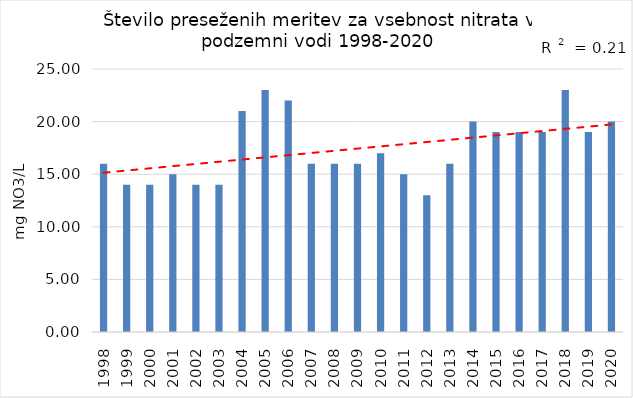
| Category | Series 0 |
|---|---|
| 1998.0 | 16 |
| 1999.0 | 14 |
| 2000.0 | 14 |
| 2001.0 | 15 |
| 2002.0 | 14 |
| 2003.0 | 14 |
| 2004.0 | 21 |
| 2005.0 | 23 |
| 2006.0 | 22 |
| 2007.0 | 16 |
| 2008.0 | 16 |
| 2009.0 | 16 |
| 2010.0 | 17 |
| 2011.0 | 15 |
| 2012.0 | 13 |
| 2013.0 | 16 |
| 2014.0 | 20 |
| 2015.0 | 19 |
| 2016.0 | 19 |
| 2017.0 | 19 |
| 2018.0 | 23 |
| 2019.0 | 19 |
| 2020.0 | 20 |